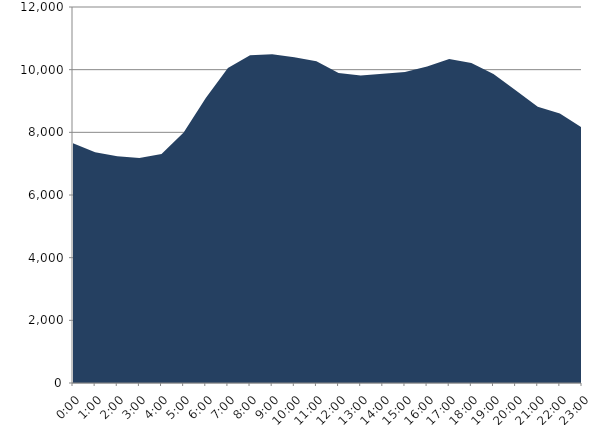
| Category | Series 0 | Series 1 |
|---|---|---|
| 2023-01-18 |  | 7652.455 |
| 2023-01-18 01:00:00 |  | 7365.054 |
| 2023-01-18 02:00:00 |  | 7235.115 |
| 2023-01-18 03:00:00 |  | 7177.526 |
| 2023-01-18 04:00:00 |  | 7307.934 |
| 2023-01-18 05:00:00 |  | 7991.262 |
| 2023-01-18 06:00:00 |  | 9095.236 |
| 2023-01-18 07:00:00 |  | 10055.641 |
| 2023-01-18 08:00:00 |  | 10458.008 |
| 2023-01-18 09:00:00 |  | 10489.09 |
| 2023-01-18 10:00:00 |  | 10393.587 |
| 2023-01-18 11:00:00 |  | 10266.275 |
| 2023-01-18 12:00:00 |  | 9895.16 |
| 2023-01-18 13:00:00 |  | 9817.177 |
| 2023-01-18 14:00:00 |  | 9866.026 |
| 2023-01-18 15:00:00 |  | 9924.887 |
| 2023-01-18 16:00:00 |  | 10102.15 |
| 2023-01-18 17:00:00 |  | 10342.997 |
| 2023-01-18 18:00:00 |  | 10214.105 |
| 2023-01-18 19:00:00 |  | 9861.701 |
| 2023-01-18 20:00:00 |  | 9344.647 |
| 2023-01-18 21:00:00 |  | 8813.369 |
| 2023-01-18 22:00:00 |  | 8597.311 |
| 2023-01-18 23:00:00 |  | 8147.525 |